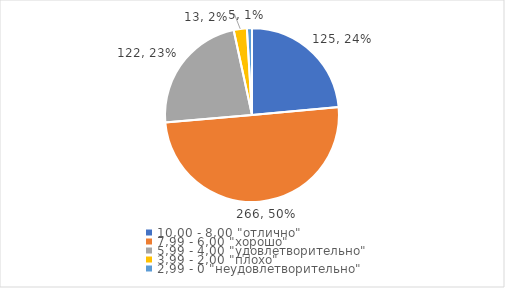
| Category | Series 0 | Series 1 |
|---|---|---|
| 10,00 - 8,00 "отлично" | 125 | 0.235 |
| 7,99 - 6,00 "хорошо" | 266 | 0.501 |
| 5,99 - 4,00 "удовлетворительно" | 122 | 0.23 |
| 3,99 - 2,00 "плохо" | 13 | 0.024 |
| 2,99 - 0 "неудовлетворительно" | 5 | 0.009 |